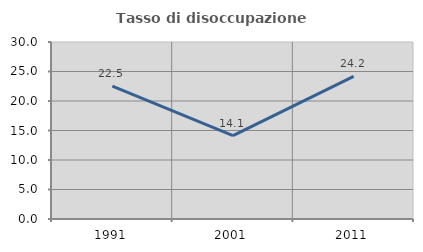
| Category | Tasso di disoccupazione giovanile  |
|---|---|
| 1991.0 | 22.521 |
| 2001.0 | 14.135 |
| 2011.0 | 24.16 |